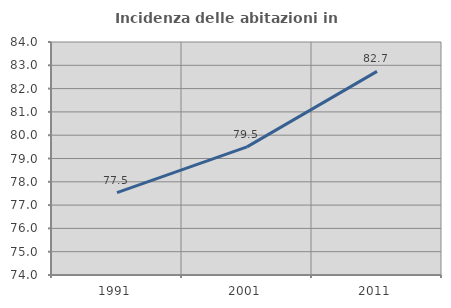
| Category | Incidenza delle abitazioni in proprietà  |
|---|---|
| 1991.0 | 77.533 |
| 2001.0 | 79.499 |
| 2011.0 | 82.74 |